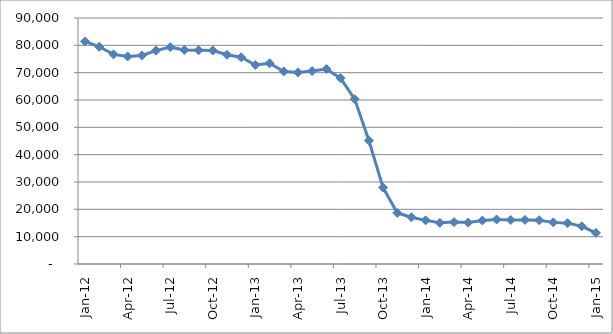
| Category | Series 0 |
|---|---|
| 2012-01-01 | 81437 |
| 2012-02-01 | 79474 |
| 2012-03-01 | 76682 |
| 2012-04-01 | 75935 |
| 2012-05-01 | 76300 |
| 2012-06-01 | 78068 |
| 2012-07-01 | 79332 |
| 2012-08-01 | 78321 |
| 2012-09-01 | 78229 |
| 2012-10-01 | 78108 |
| 2012-11-01 | 76552 |
| 2012-12-01 | 75633 |
| 2013-01-01 | 72813 |
| 2013-02-01 | 73438 |
| 2013-03-01 | 70429 |
| 2013-04-01 | 70094 |
| 2013-05-01 | 70592 |
| 2013-06-01 | 71343 |
| 2013-07-01 | 67994 |
| 2013-08-01 | 60327 |
| 2013-09-01 | 45154 |
| 2013-10-01 | 27964 |
| 2013-11-01 | 18662 |
| 2013-12-01 | 17102 |
| 2014-01-01 | 15969 |
| 2014-02-01 | 15054 |
| 2014-03-01 | 15337 |
| 2014-04-01 | 15161 |
| 2014-05-01 | 15919 |
| 2014-06-01 | 16288 |
| 2014-07-01 | 16110 |
| 2014-08-01 | 16138 |
| 2014-09-01 | 16040 |
| 2014-10-01 | 15228 |
| 2014-11-01 | 14950 |
| 2014-12-01 | 13798 |
| 2015-01-01 | 11386 |